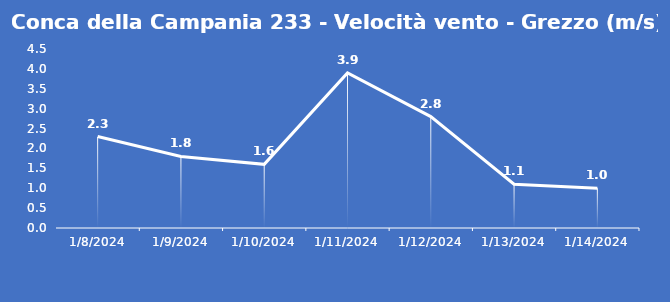
| Category | Conca della Campania 233 - Velocità vento - Grezzo (m/s) |
|---|---|
| 1/8/24 | 2.3 |
| 1/9/24 | 1.8 |
| 1/10/24 | 1.6 |
| 1/11/24 | 3.9 |
| 1/12/24 | 2.8 |
| 1/13/24 | 1.1 |
| 1/14/24 | 1 |